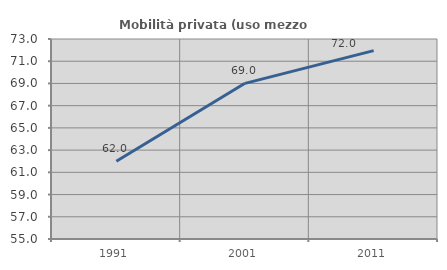
| Category | Mobilità privata (uso mezzo privato) |
|---|---|
| 1991.0 | 61.994 |
| 2001.0 | 69.01 |
| 2011.0 | 71.953 |